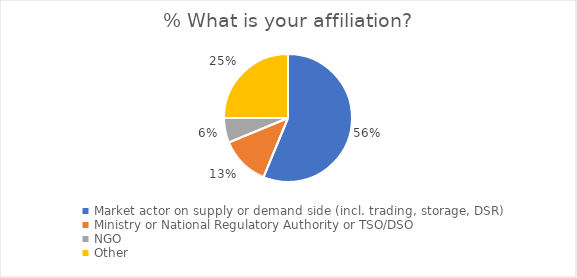
| Category | % What is your affiliation? |
|---|---|
| Market actor on supply or demand side (incl. trading, storage, DSR) | 0.562 |
| Ministry or National Regulatory Authority or TSO/DSO | 0.125 |
| NGO | 0.062 |
| Other | 0.25 |